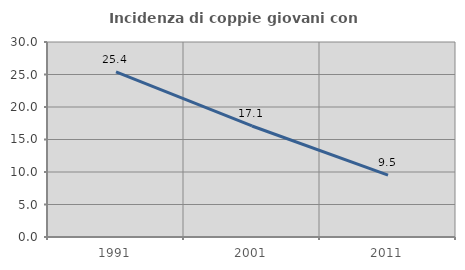
| Category | Incidenza di coppie giovani con figli |
|---|---|
| 1991.0 | 25.394 |
| 2001.0 | 17.082 |
| 2011.0 | 9.531 |